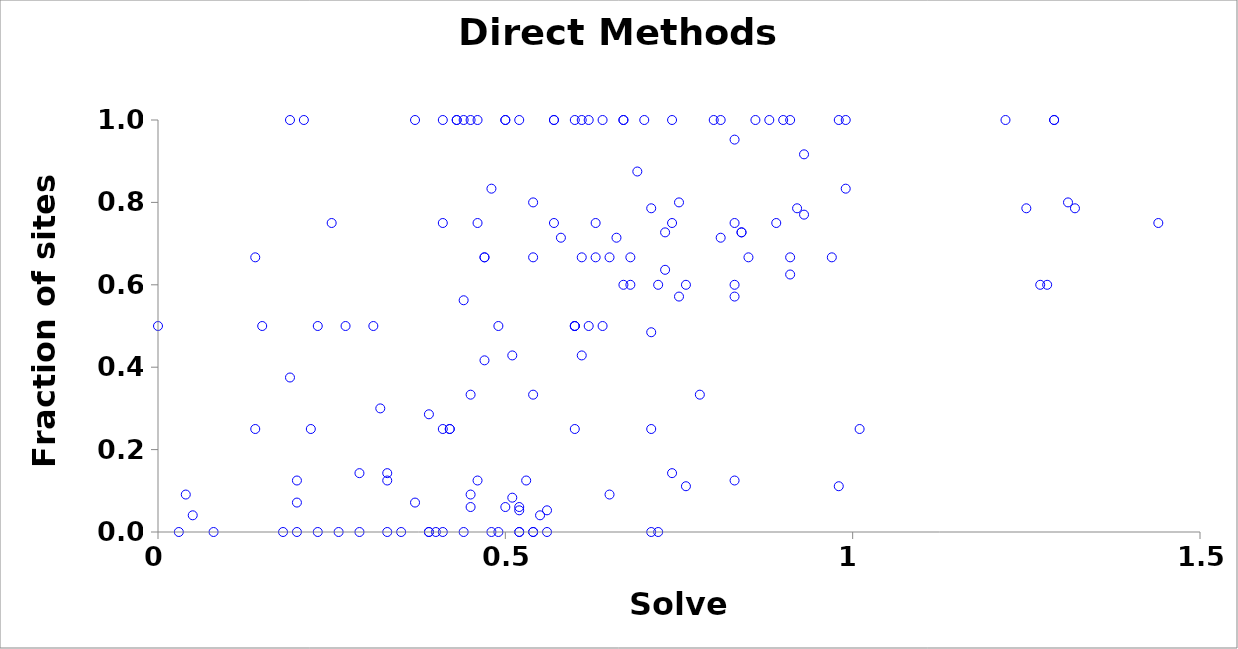
| Category | LLGC |
|---|---|
| 0.56 | 0 |
| 0.45 | 1 |
| 0.08 | 0 |
| 0.39 | 0 |
| 0.6 | 1 |
| 0.5 | 1 |
| 0.21 | 1 |
| 0.18 | 0 |
| 0.47 | 0.667 |
| 0.54 | 0.333 |
| 0.65 | 0.667 |
| 0.03 | 0 |
| 0.45 | 0.333 |
| 0.23 | 0 |
| 0.67 | 1 |
| 0.68 | 0.667 |
| 0.14 | 0.667 |
| 0.91 | 1 |
| 0.97 | 0.667 |
| 1.22 | 1 |
| 0.63 | 0.667 |
| 0.61 | 0.667 |
| 0.91 | 0.667 |
| 0.14 | 0.25 |
| 0.39 | 0 |
| 1.01 | 0.25 |
| 0.41 | 0.25 |
| 0.35 | 0 |
| 0.15 | 0.5 |
| 0.31 | 0.5 |
| 0.49 | 0.5 |
| 0.6 | 0.5 |
| 0.64 | 0.5 |
| 0.41 | 0 |
| 0.25 | 0.75 |
| 0.44 | 1 |
| 0.5 | 1 |
| 0.46 | 0.75 |
| 0.22 | 0.25 |
| 0.52 | 1 |
| 0.27 | 0.5 |
| 0.7 | 1 |
| 0.41 | 0.75 |
| 0.88 | 1 |
| 0.64 | 1 |
| 0.19 | 1 |
| 0.43 | 1 |
| 0.46 | 1 |
| 0.57 | 0.75 |
| 0.52 | 0 |
| 0.76 | 0.6 |
| 1.28 | 0.6 |
| 0.48 | 0 |
| 0.67 | 0.6 |
| 0.68 | 0.6 |
| 0.54 | 0.8 |
| 0.86 | 1 |
| 1.31 | 0.8 |
| 0.71 | 0 |
| 0.49 | 0 |
| 1.27 | 0.6 |
| 0.43 | 1 |
| 0.41 | 1 |
| 0.57 | 1 |
| 0.62 | 1 |
| 0.57 | 1 |
| 0.81 | 1 |
| 0.74 | 1 |
| 0.67 | 1 |
| 0.61 | 1 |
| 0.9 | 1 |
| 1.29 | 1 |
| 1.29 | 1 |
| 0.8 | 1 |
| 0.99 | 1 |
| 0.29 | 0.143 |
| 0.75 | 0.571 |
| 0.33 | 0.143 |
| 0.83 | 0.571 |
| 0.39 | 0.286 |
| 0.51 | 0.429 |
| 0.2 | 0.125 |
| 0.83 | 0.125 |
| 0.42 | 0.25 |
| 0.6 | 0.25 |
| 0.42 | 0.25 |
| 0.71 | 0.25 |
| 0.37 | 1 |
| 0.54 | 0 |
| 0.54 | 0 |
| 0.0 | 0.5 |
| 0.46 | 0.125 |
| 0.19 | 0.375 |
| 0.4 | 0 |
| 0.44 | 0 |
| 0.98 | 1 |
| 0.33 | 0 |
| 0.62 | 0.5 |
| 0.72 | 0 |
| 0.53 | 0.125 |
| 0.29 | 0 |
| 0.69 | 0.875 |
| 1.7 | 1 |
| 0.52 | 0 |
| 1.67 | 0.75 |
| 0.26 | 0 |
| 0.47 | 0.667 |
| 0.54 | 0.667 |
| 0.85 | 0.667 |
| 0.32 | 0.3 |
| 0.2 | 0 |
| 0.6 | 0.5 |
| 0.72 | 0.6 |
| 0.23 | 0.5 |
| 0.83 | 0.6 |
| 0.75 | 0.8 |
| 0.6 | 0.5 |
| 0.65 | 0.091 |
| 0.04 | 0.091 |
| 0.73 | 0.727 |
| 0.73 | 0.636 |
| 0.84 | 0.727 |
| 0.93 | 0.917 |
| 0.74 | 0.75 |
| 1.44 | 0.75 |
| 0.51 | 0.083 |
| 0.47 | 0.417 |
| 0.63 | 0.75 |
| 0.83 | 0.75 |
| 0.74 | 0.143 |
| 0.2 | 0.071 |
| 0.37 | 0.071 |
| 0.61 | 0.429 |
| 0.71 | 0.786 |
| 0.81 | 0.714 |
| 1.25 | 0.786 |
| 0.58 | 0.714 |
| 0.92 | 0.786 |
| 2.06 | 0.786 |
| 1.32 | 0.786 |
| 0.91 | 0.625 |
| 0.33 | 0.125 |
| 0.44 | 0.562 |
| 0.89 | 0.75 |
| 0.48 | 0.833 |
| 0.99 | 0.833 |
| 0.66 | 0.714 |
| 0.83 | 0.952 |
| 0.45 | 0.091 |
| 0.84 | 0.727 |
| 0.98 | 0.111 |
| 0.78 | 0.333 |
| 0.76 | 0.111 |
| 0.52 | 0.061 |
| 0.5 | 0.061 |
| 0.71 | 0.485 |
| 0.56 | 0.053 |
| 0.52 | 0.053 |
| 0.45 | 0.061 |
| 0.55 | 0.041 |
| 0.05 | 0.041 |
| 0.93 | 0.77 |